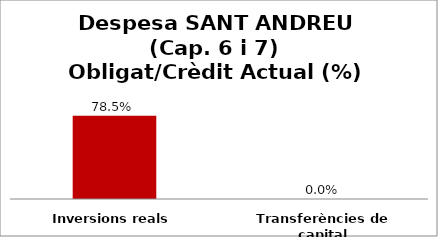
| Category | Series 0 |
|---|---|
| Inversions reals | 0.785 |
| Transferències de capital | 0 |